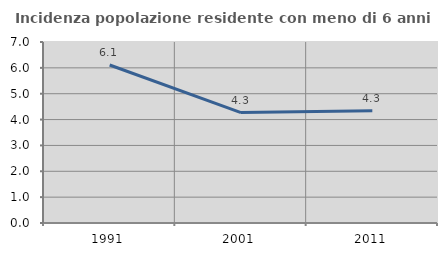
| Category | Incidenza popolazione residente con meno di 6 anni |
|---|---|
| 1991.0 | 6.111 |
| 2001.0 | 4.27 |
| 2011.0 | 4.344 |